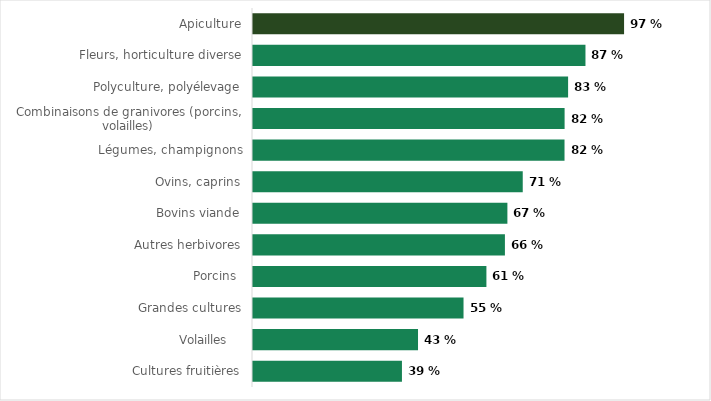
| Category | Part vendant en circuit court selon leur spécialisation |
|---|---|
| Apiculture | 0.974 |
| Fleurs, horticulture diverse | 0.873 |
| Polyculture, polyélevage | 0.827 |
| Combinaisons de granivores (porcins, volailles) | 0.818 |
| Légumes, champignons | 0.818 |
| Ovins, caprins | 0.708 |
| Bovins viande | 0.668 |
| Autres herbivores | 0.662 |
| Porcins  | 0.613 |
| Grandes cultures | 0.553 |
| Volailles    | 0.433 |
| Cultures fruitières | 0.391 |